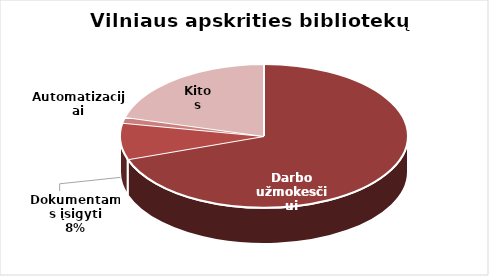
| Category | Series 0 |
|---|---|
| Darbo užmokesčiui | 3905778.21 |
| Dokumentams įsigyti | 461179.99 |
| Automatizacijai | 71538 |
| Kitos | 1164048 |